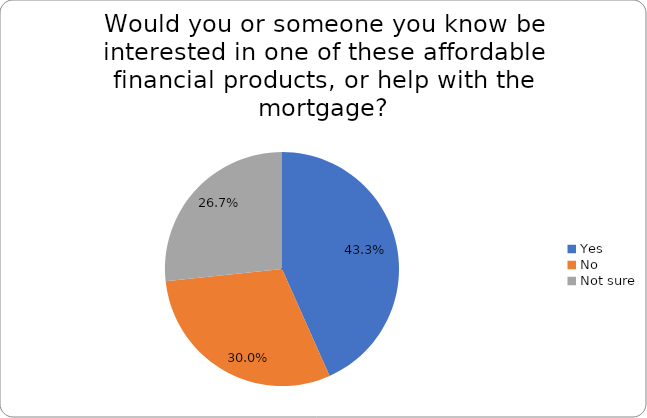
| Category | Series 0 |
|---|---|
| Yes | 0.433 |
| No | 0.3 |
| Not sure | 0.267 |